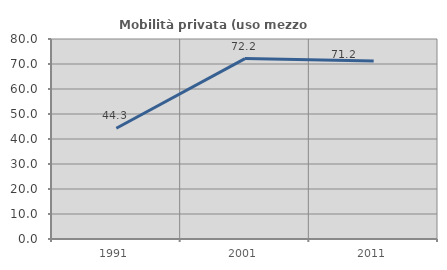
| Category | Mobilità privata (uso mezzo privato) |
|---|---|
| 1991.0 | 44.312 |
| 2001.0 | 72.165 |
| 2011.0 | 71.154 |